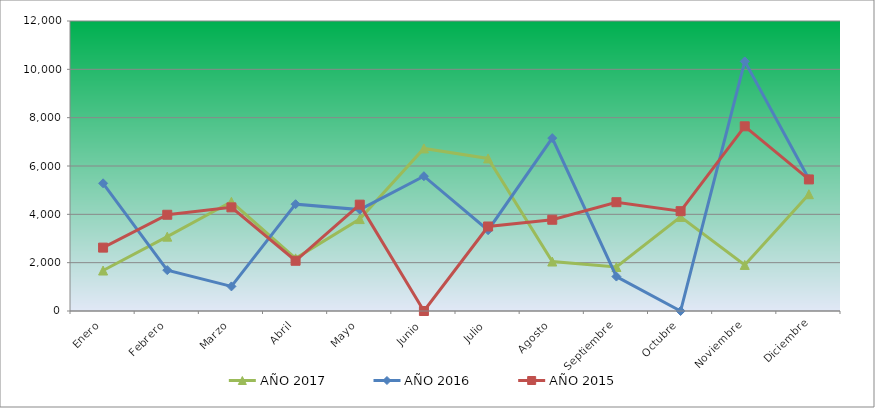
| Category | AÑO 2017 | AÑO 2016 | AÑO 2015 |
|---|---|---|---|
| Enero | 1675.14 | 5283.92 | 2622.541 |
| Febrero | 3076.35 | 1690.748 | 3982.294 |
| Marzo | 4519.438 | 1017.486 | 4288.36 |
| Abril | 2178.185 | 4420.262 | 2078.182 |
| Mayo | 3803.487 | 4195.883 | 4400.916 |
| Junio | 6726.3 | 5577.975 | 0 |
| Julio | 6313.057 | 3343.244 | 3496.785 |
| Agosto | 2047.393 | 7154.486 | 3775.279 |
| Septiembre | 1821.023 | 1424.805 | 4502.216 |
| Octubre | 3892.981 | 0 | 4130.783 |
| Noviembre | 1906.541 | 10329.27 | 7642.511 |
| Diciembre | 4832.666 | 5463.207 | 5444.421 |